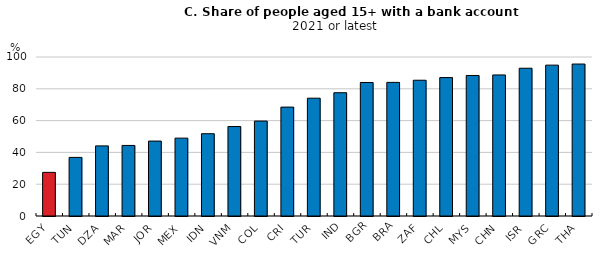
| Category | Share of people aged 15+ with a bank account |
|---|---|
| EGY | 27.444 |
| TUN | 36.853 |
| DZA | 44.097 |
| MAR | 44.373 |
| JOR | 47.12 |
| MEX | 48.971 |
| IDN | 51.755 |
| VNM | 56.266 |
| COL | 59.716 |
| CRI | 68.49 |
| TUR | 74.092 |
| IND | 77.529 |
| BGR | 83.967 |
| BRA | 84.036 |
| ZAF | 85.378 |
| CHL | 87.062 |
| MYS | 88.375 |
| CHN | 88.709 |
| ISR | 92.925 |
| GRC | 94.884 |
| THA | 95.577 |